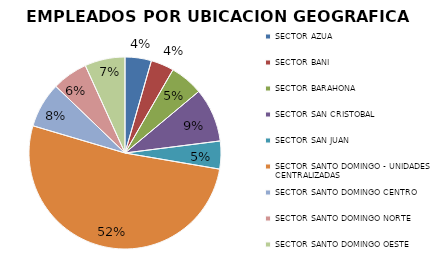
| Category | Series 0 |
|---|---|
| SECTOR AZUA | 121 |
| SECTOR BANI | 106 |
| SECTOR BARAHONA | 153 |
| SECTOR SAN CRISTOBAL | 247 |
| SECTOR SAN JUAN | 128 |
| SECTOR SANTO DOMINGO - UNIDADES CENTRALIZADAS | 1415 |
| SECTOR SANTO DOMINGO CENTRO | 208 |
| SECTOR SANTO DOMINGO NORTE | 164 |
| SECTOR SANTO DOMINGO OESTE | 185 |